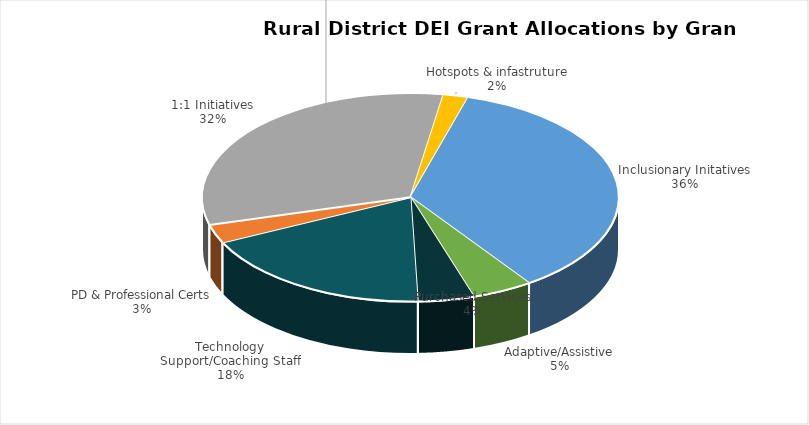
| Category | $1,719,816 |
|---|---|
| Technology Support/Coaching Staff | 1719816 |
| PD & Professional Certs | 266586 |
| 1:1 Initiatives | 2970324 |
| Hotspots & infastruture | 181261 |
| Inclusionary Initatives | 3351246 |
| Adaptive/Assistive | 439376 |
| Purchased Services | 407112 |